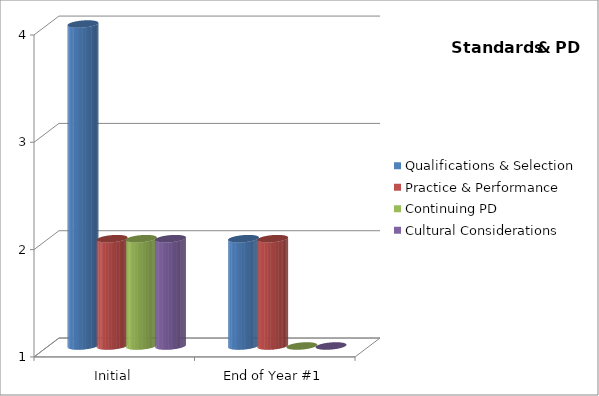
| Category | Qualifications & Selection  | Practice & Performance  | Continuing PD | Cultural Considerations  |
|---|---|---|---|---|
| Initial | 4 | 2 | 2 | 2 |
| End of Year #1 | 2 | 2 | 1 | 1 |